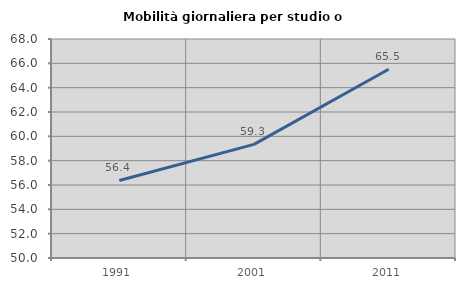
| Category | Mobilità giornaliera per studio o lavoro |
|---|---|
| 1991.0 | 56.376 |
| 2001.0 | 59.338 |
| 2011.0 | 65.51 |